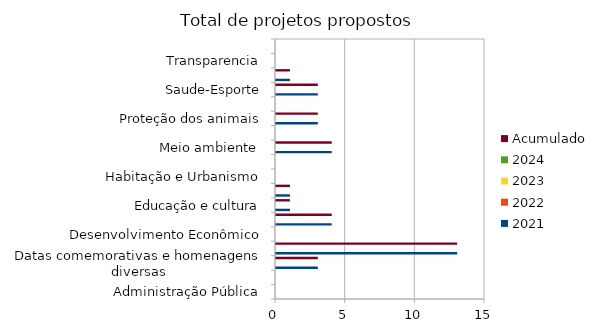
| Category | 2021 | 2022 | 2023 | 2024 | Acumulado |
|---|---|---|---|---|---|
| Administração Pública | 0 |  |  |  | 0 |
| Combate à corrupção  | 0 |  |  |  | 0 |
| Datas comemorativas e homenagens diversas | 3 |  |  |  | 3 |
| Denominação de logradouro | 13 |  |  |  | 13 |
| Desenvolvimento Econômico | 0 |  |  |  | 0 |
| Desenvolvimento Social  | 4 |  |  |  | 4 |
| Educação e cultura | 1 |  |  |  | 1 |
| Frente parlamentar | 1 |  |  |  | 1 |
| Habitação e Urbanismo | 0 |  |  |  | 0 |
| Lei Orgânica do Município | 0 |  |  |  | 0 |
| Meio ambiente  | 4 |  |  |  | 4 |
| Mobilidade | 0 |  |  |  | 0 |
| Proteção dos animais | 3 |  |  |  | 3 |
| Regimento Interno da CMSP | 0 |  |  |  | 0 |
| Saude-Esporte | 3 |  |  |  | 3 |
| Segurança Pública | 1 |  |  |  | 1 |
| Transparencia | 0 |  |  |  | 0 |
| Tributação | 0 |  |  |  | 0 |